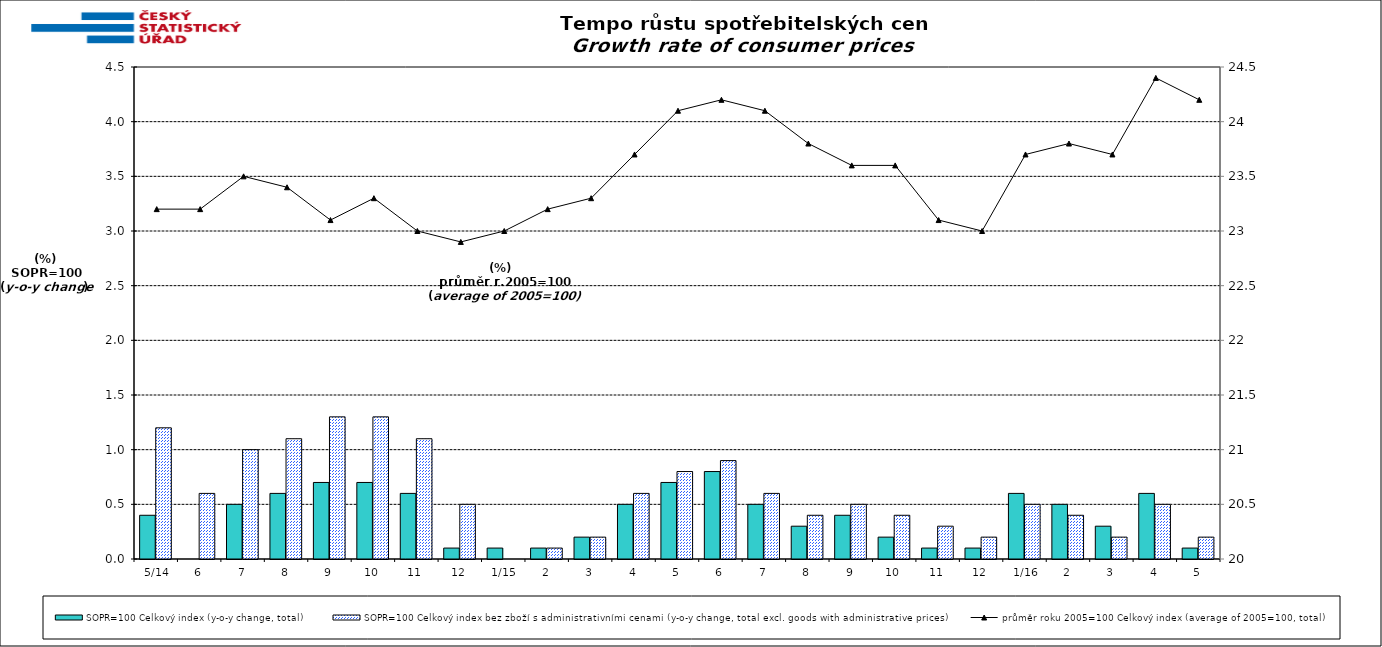
| Category | SOPR=100 Celkový index (y-o-y change, total) | SOPR=100 Celkový index bez zboží s administrativními cenami (y-o-y change, total excl. goods with administrative prices)  |
|---|---|---|
|  5/14 | 0.4 | 1.2 |
| 6 | 0 | 0.6 |
| 7 | 0.5 | 1 |
| 8 | 0.6 | 1.1 |
| 9 | 0.7 | 1.3 |
| 10 | 0.7 | 1.3 |
| 11 | 0.6 | 1.1 |
| 12 | 0.1 | 0.5 |
|  1/15 | 0.1 | 0 |
| 2 | 0.1 | 0.1 |
| 3 | 0.2 | 0.2 |
| 4 | 0.5 | 0.6 |
| 5 | 0.7 | 0.8 |
| 6 | 0.8 | 0.9 |
| 7 | 0.5 | 0.6 |
| 8 | 0.3 | 0.4 |
| 9 | 0.4 | 0.5 |
| 10 | 0.2 | 0.4 |
| 11 | 0.1 | 0.3 |
| 12 | 0.1 | 0.2 |
|  1/16 | 0.6 | 0.5 |
| 2 | 0.5 | 0.4 |
| 3 | 0.3 | 0.2 |
| 4 | 0.6 | 0.5 |
| 5 | 0.1 | 0.2 |